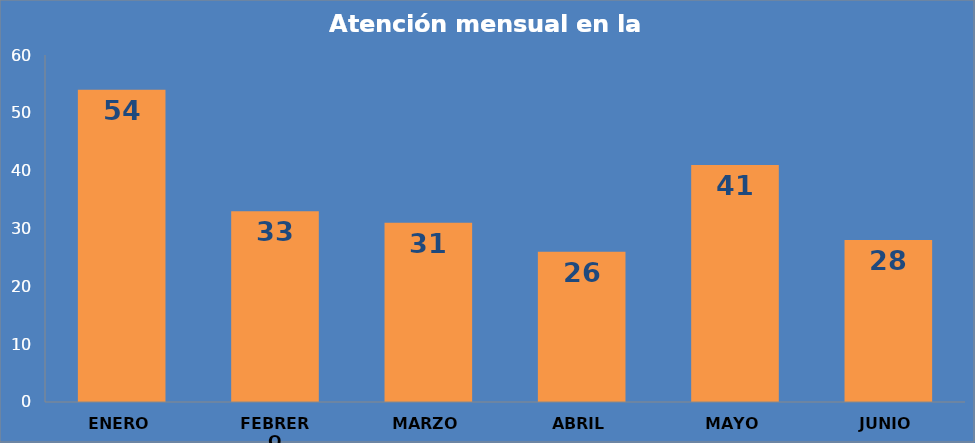
| Category | Series 0 |
|---|---|
| ENERO | 54 |
| FEBRERO | 33 |
| MARZO | 31 |
| ABRIL | 26 |
| MAYO | 41 |
| JUNIO | 28 |